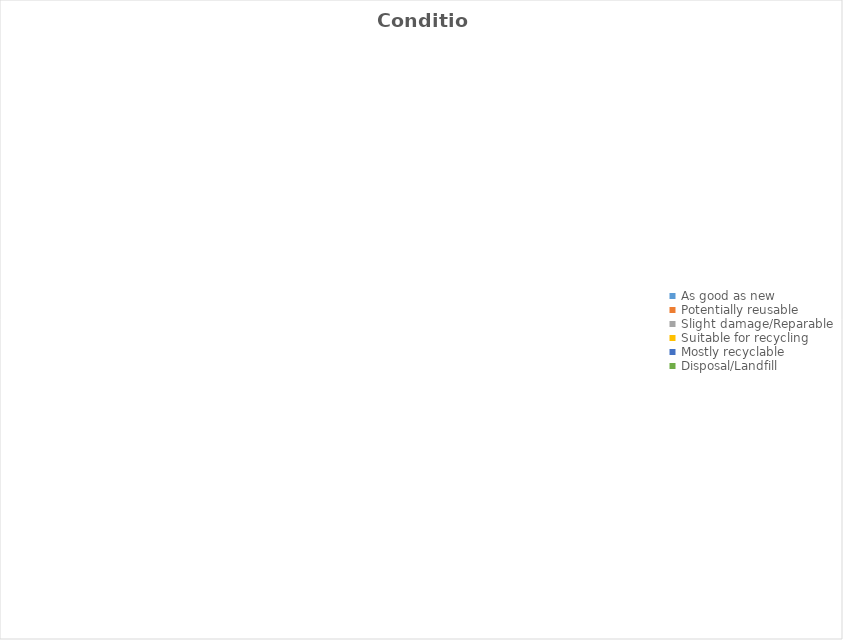
| Category | Volume |
|---|---|
| As good as new | 0 |
| Potentially reusable | 0 |
| Slight damage/Reparable | 0 |
| Suitable for recycling | 0 |
| Mostly recyclable | 0 |
| Disposal/Landfill | 0 |